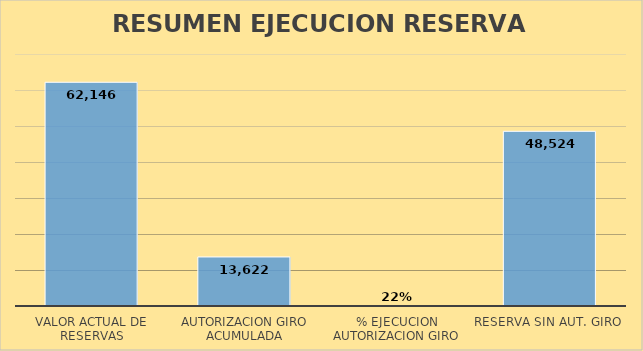
| Category | 3 |
|---|---|
| VALOR ACTUAL DE RESERVAS | 62146.077 |
| AUTORIZACION GIRO ACUMULADA | 13621.808 |
| % EJECUCION AUTORIZACION GIRO | 0.219 |
| RESERVA SIN AUT. GIRO | 48524.268 |